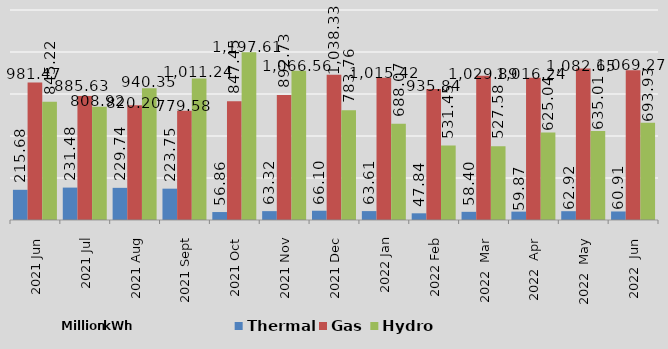
| Category | Thermal | Gas | Hydro |
|---|---|---|---|
| 2021 Jun | 215.68 | 981.47 | 845.22 |
| 2021 Jul | 231.48 | 885.63 | 808.92 |
| 2021 Aug | 229.74 | 820.2 | 940.35 |
| 2021 Sept | 223.75 | 779.58 | 1011.24 |
| 2021 Oct | 56.858 | 847.45 | 1197.61 |
| 2021 Nov | 63.323 | 892.73 | 1066.56 |
| 2021 Dec | 66.099 | 1038.33 | 783.76 |
| 2022 Jan | 63.608 | 1015.419 | 688.07 |
| 2022 Feb | 47.838 | 935.842 | 531.45 |
| 2022  Mar | 58.4 | 1029.89 | 527.58 |
| 2022  Apr | 59.87 | 1016.24 | 625.04 |
| 2022  May | 62.92 | 1082.65 | 635.01 |
| 2022  Jun | 60.91 | 1069.27 | 693.93 |